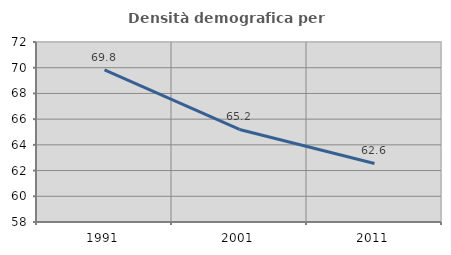
| Category | Densità demografica |
|---|---|
| 1991.0 | 69.824 |
| 2001.0 | 65.196 |
| 2011.0 | 62.551 |